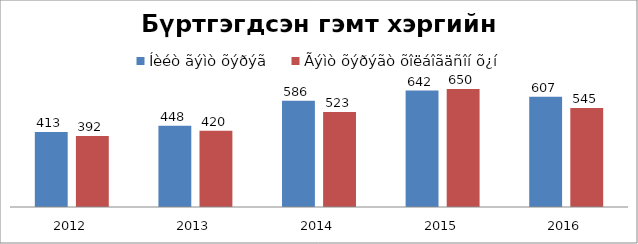
| Category | Íèéò ãýìò õýðýã | Ãýìò õýðýãò õîëáîãäñîí õ¿í |
|---|---|---|
| 2012.0 | 413 | 392 |
| 2013.0 | 448 | 420 |
| 2014.0 | 586 | 523 |
| 2015.0 | 642 | 650 |
| 2016.0 | 607 | 545 |